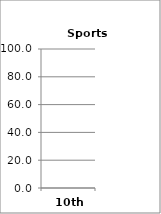
| Category | Sports (Choices) |
|---|---|
| 10th | 0 |